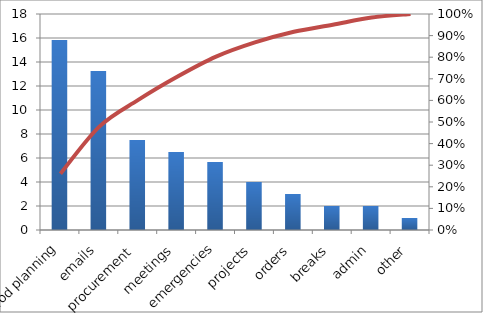
| Category | Hrs spent |
|---|---|
| prod planning | 15.833 |
| emails | 13.25 |
| procurement | 7.5 |
| meetings | 6.5 |
| emergencies | 5.667 |
| projects | 4 |
| orders | 3 |
| breaks | 2 |
| admin | 2 |
| other | 1 |